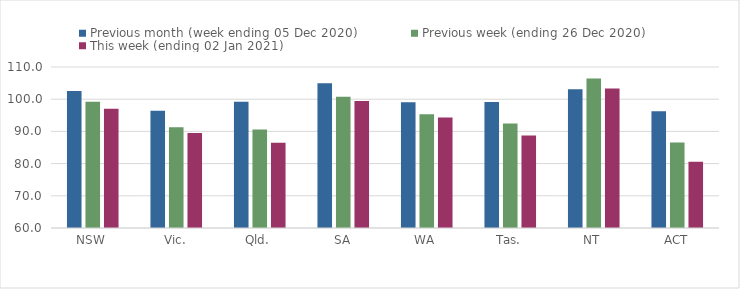
| Category | Previous month (week ending 05 Dec 2020) | Previous week (ending 26 Dec 2020) | This week (ending 02 Jan 2021) |
|---|---|---|---|
| NSW | 102.51 | 99.17 | 97.03 |
| Vic. | 96.4 | 91.29 | 89.49 |
| Qld. | 99.23 | 90.57 | 86.5 |
| SA | 104.94 | 100.76 | 99.47 |
| WA | 99.07 | 95.29 | 94.32 |
| Tas. | 99.16 | 92.46 | 88.71 |
| NT | 103.11 | 106.4 | 103.34 |
| ACT | 96.24 | 86.59 | 80.61 |